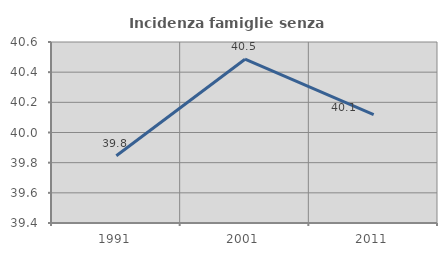
| Category | Incidenza famiglie senza nuclei |
|---|---|
| 1991.0 | 39.845 |
| 2001.0 | 40.486 |
| 2011.0 | 40.119 |